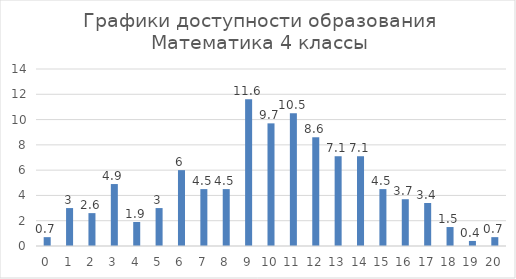
| Category | Series 0 |
|---|---|
| 0.0 | 0.7 |
| 1.0 | 3 |
| 2.0 | 2.6 |
| 3.0 | 4.9 |
| 4.0 | 1.9 |
| 5.0 | 3 |
| 6.0 | 6 |
| 7.0 | 4.5 |
| 8.0 | 4.5 |
| 9.0 | 11.6 |
| 10.0 | 9.7 |
| 11.0 | 10.5 |
| 12.0 | 8.6 |
| 13.0 | 7.1 |
| 14.0 | 7.1 |
| 15.0 | 4.5 |
| 16.0 | 3.7 |
| 17.0 | 3.4 |
| 18.0 | 1.5 |
| 19.0 | 0.4 |
| 20.0 | 0.7 |